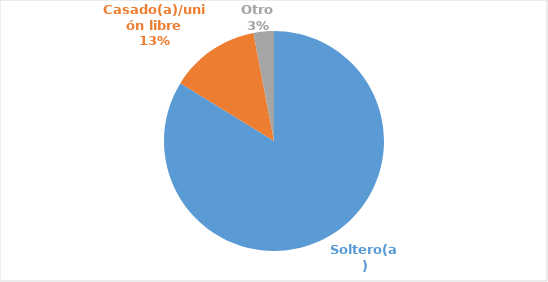
| Category | Series 0 |
|---|---|
| Soltero(a) | 0.839 |
| Casado(a)/unión libre | 0.132 |
| Otro | 0.03 |